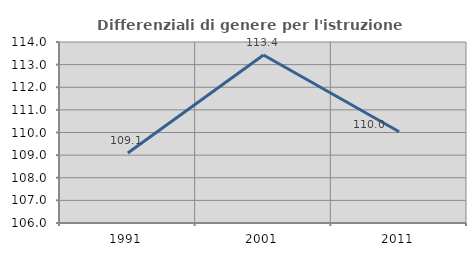
| Category | Differenziali di genere per l'istruzione superiore |
|---|---|
| 1991.0 | 109.091 |
| 2001.0 | 113.423 |
| 2011.0 | 110.036 |